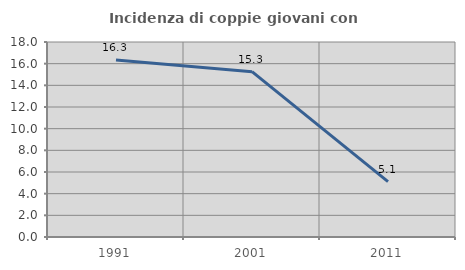
| Category | Incidenza di coppie giovani con figli |
|---|---|
| 1991.0 | 16.34 |
| 2001.0 | 15.263 |
| 2011.0 | 5.118 |